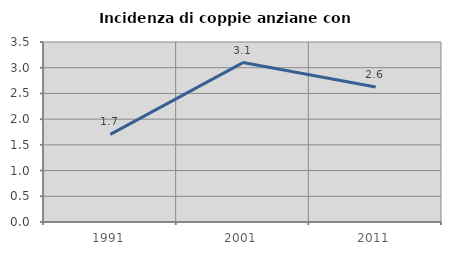
| Category | Incidenza di coppie anziane con figli |
|---|---|
| 1991.0 | 1.705 |
| 2001.0 | 3.1 |
| 2011.0 | 2.624 |